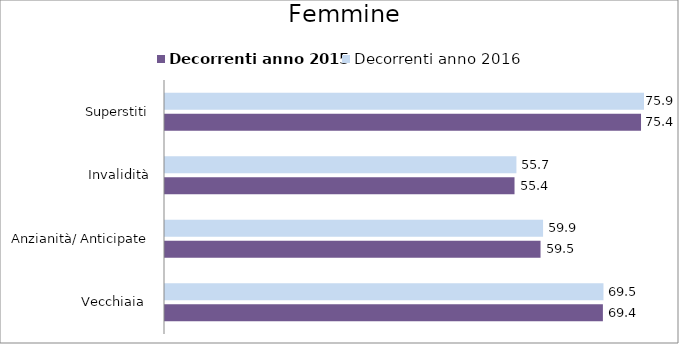
| Category | Decorrenti anno 2015 | Decorrenti anno 2016 |
|---|---|---|
| Vecchiaia  | 69.37 | 69.46 |
| Anzianità/ Anticipate | 59.49 | 59.89 |
| Invalidità | 55.37 | 55.67 |
| Superstiti | 75.41 | 75.88 |